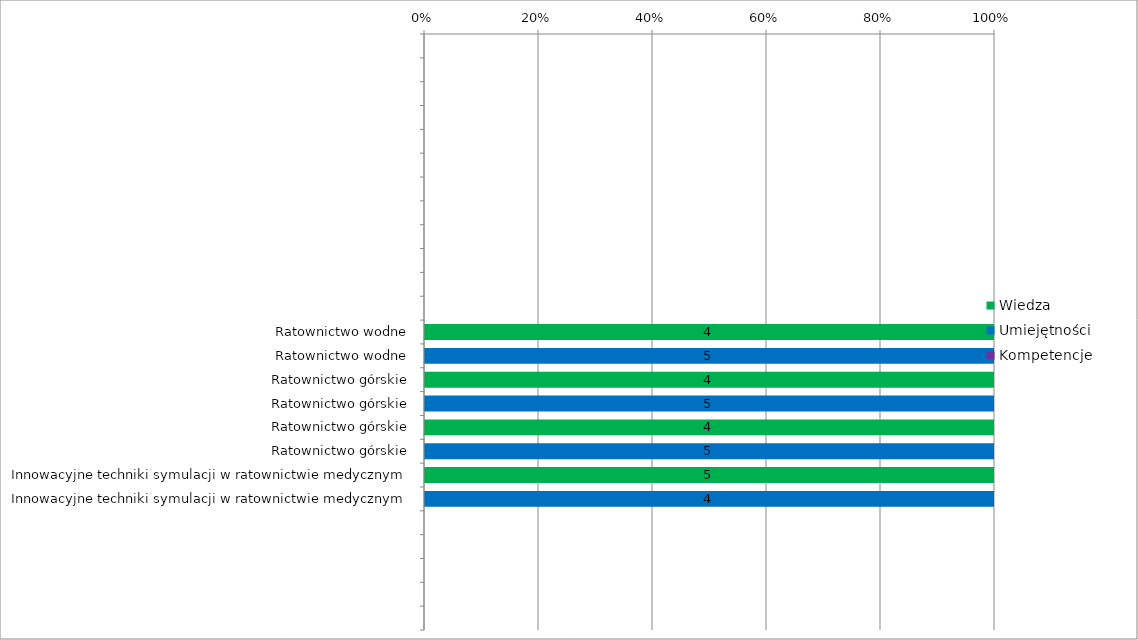
| Category | Wiedza | Umiejętności | Kompetencje |
|---|---|---|---|
|  | 0 | 0 | 0 |
|  | 0 | 0 | 0 |
|  | 0 | 0 | 0 |
|  | 0 | 0 | 0 |
|  | 0 | 0 | 0 |
|  | 0 | 0 | 0 |
|  | 0 | 0 | 0 |
|  | 0 | 0 | 0 |
|  | 0 | 0 | 0 |
|  | 0 | 0 | 0 |
|  | 0 | 0 | 0 |
|  | 0 | 0 | 0 |
| Ratownictwo wodne | 4 | 0 | 0 |
| Ratownictwo wodne | 0 | 5 | 0 |
| Ratownictwo górskie | 4 | 0 | 0 |
| Ratownictwo górskie | 0 | 5 | 0 |
| Ratownictwo górskie | 4 | 0 | 0 |
| Ratownictwo górskie | 0 | 5 | 0 |
| Innowacyjne techniki symulacji w ratownictwie medycznym | 5 | 0 | 0 |
| Innowacyjne techniki symulacji w ratownictwie medycznym | 0 | 4 | 0 |